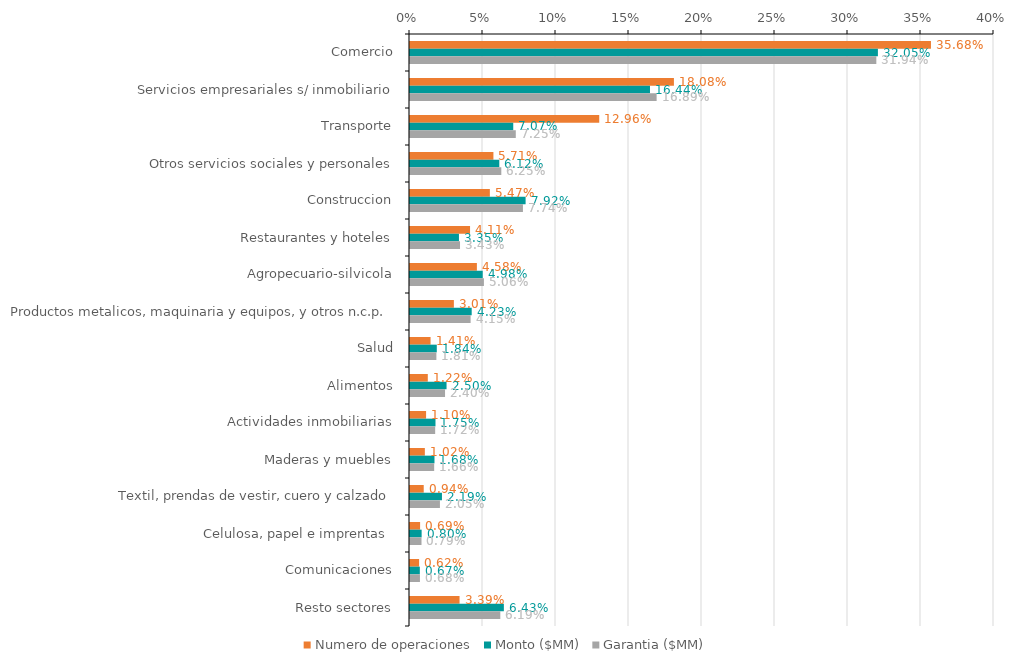
| Category | Numero de operaciones | Monto ($MM) | Garantia ($MM) |
|---|---|---|---|
| Comercio | 0.357 | 0.32 | 0.319 |
| Servicios empresariales s/ inmobiliario | 0.181 | 0.164 | 0.169 |
| Transporte | 0.13 | 0.071 | 0.072 |
| Otros servicios sociales y personales | 0.057 | 0.061 | 0.063 |
| Construccion | 0.055 | 0.079 | 0.077 |
| Restaurantes y hoteles | 0.041 | 0.034 | 0.034 |
| Agropecuario-silvicola | 0.046 | 0.05 | 0.051 |
| Productos metalicos, maquinaria y equipos, y otros n.c.p. | 0.03 | 0.042 | 0.042 |
| Salud | 0.014 | 0.018 | 0.018 |
| Alimentos | 0.012 | 0.025 | 0.024 |
| Actividades inmobiliarias | 0.011 | 0.017 | 0.017 |
| Maderas y muebles | 0.01 | 0.017 | 0.017 |
| Textil, prendas de vestir, cuero y calzado | 0.009 | 0.022 | 0.021 |
| Celulosa, papel e imprentas  | 0.007 | 0.008 | 0.008 |
| Comunicaciones | 0.006 | 0.007 | 0.007 |
| Resto sectores | 0.034 | 0.064 | 0.062 |